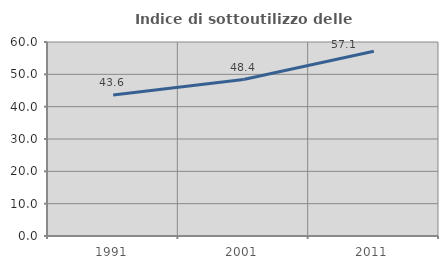
| Category | Indice di sottoutilizzo delle abitazioni  |
|---|---|
| 1991.0 | 43.59 |
| 2001.0 | 48.387 |
| 2011.0 | 57.143 |